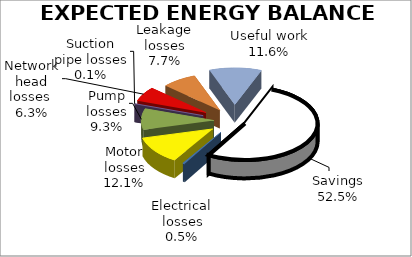
| Category | 5.3  EXPECTED ENERGY BALANCE | Series 1 | Series 2 |
|---|---|---|---|
| Electrical losses | 343.659 |  |  |
| Motor losses | 8947.376 |  |  |
| Pump losses | 6832.604 |  |  |
| Suction pipe losses | 52.452 |  |  |
| Network head losses  | 4652.843 |  |  |
| Leakage losses | 5698.205 |  |  |
| Useful work | 8547.308 |  |  |
| Savings | 38576.496 |  |  |